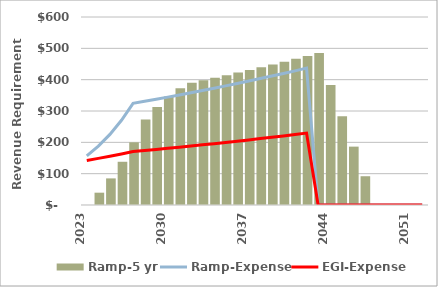
| Category | Ramp-5 yr |
|---|---|
| 2023.0 | 0 |
| 2024.0 | 39.312 |
| 2025.0 | 84.883 |
| 2026.0 | 137.966 |
| 2027.0 | 200.062 |
| 2028.0 | 272.974 |
| 2029.0 | 312.896 |
| 2030.0 | 346.434 |
| 2031.0 | 372.622 |
| 2032.0 | 390.308 |
| 2033.0 | 398.114 |
| 2034.0 | 406.076 |
| 2035.0 | 414.198 |
| 2036.0 | 422.482 |
| 2037.0 | 430.931 |
| 2038.0 | 439.55 |
| 2039.0 | 448.341 |
| 2040.0 | 457.308 |
| 2041.0 | 466.454 |
| 2042.0 | 475.783 |
| 2043.0 | 485.299 |
| 2044.0 | 383.099 |
| 2045.0 | 283.419 |
| 2046.0 | 186.308 |
| 2047.0 | 91.817 |
| 2048.0 | 0 |
| 2049.0 | 0 |
| 2050.0 | 0 |
| 2051.0 | 0 |
| 2052.0 | 0 |